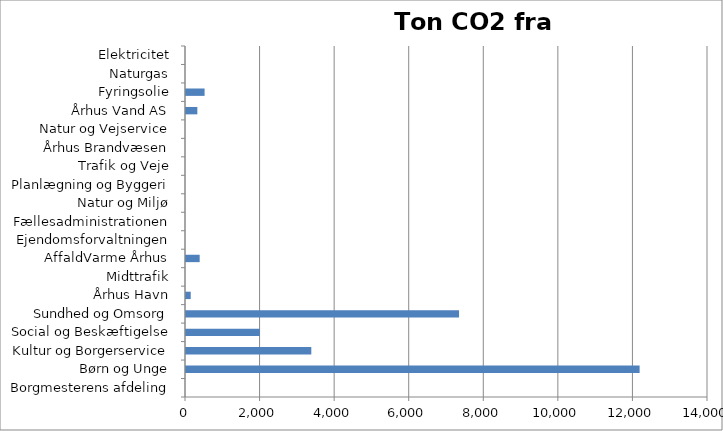
| Category | Ton CO2 |
|---|---|
| Borgmesterens afdeling | 0 |
| Børn og Unge | 12166 |
| Kultur og Borgerservice | 3360.796 |
| Social og Beskæftigelse | 1980.375 |
| Sundhed og Omsorg | 7323 |
| Århus Havn | 126.652 |
| Midttrafik | 0 |
| AffaldVarme Århus | 366.672 |
| Ejendomsforvaltningen | 0 |
| Fællesadministrationen | 0 |
| Natur og Miljø | 0 |
| Planlægning og Byggeri | 0 |
| Trafik og Veje | 0 |
| Århus Brandvæsen | 0 |
| Natur og Vejservice | 0 |
| Århus Vand AS | 304.174 |
| Fyringsolie | 498.468 |
| Naturgas | 0 |
| Elektricitet | 0 |